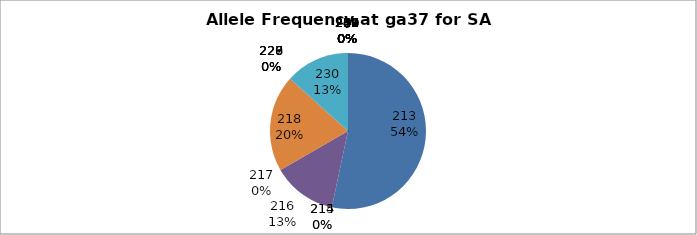
| Category | Series 0 |
|---|---|
| 207.0 | 0 |
| 208.0 | 0 |
| 209.0 | 0 |
| 210.0 | 0 |
| 211.0 | 0 |
| 212.0 | 0 |
| 213.0 | 0.533 |
| 214.0 | 0 |
| 215.0 | 0 |
| 216.0 | 0.133 |
| 217.0 | 0 |
| 218.0 | 0.2 |
| 226.0 | 0 |
| 227.0 | 0 |
| 228.0 | 0 |
| 229.0 | 0 |
| 230.0 | 0.133 |
| 231.0 | 0 |
| 232.0 | 0 |
| 234.0 | 0 |
| 239.0 | 0 |
| 240.0 | 0 |
| 247.0 | 0 |
| 248.0 | 0 |
| 249.0 | 0 |
| 250.0 | 0 |